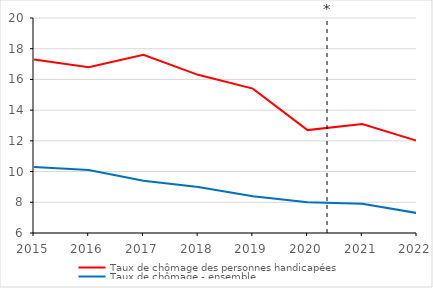
| Category | Taux de chômage des personnes handicapées | Taux de chômage - ensemble |
|---|---|---|
| 2015.0 | 17.3 | 10.3 |
| 2016.0 | 16.8 | 10.1 |
| 2017.0 | 17.6 | 9.4 |
| 2018.0 | 16.3 | 9 |
| 2019.0 | 15.4 | 8.4 |
| 2020.0 | 12.7 | 8 |
| 2021.0 | 13.1 | 7.9 |
| 2022.0 | 12 | 7.3 |